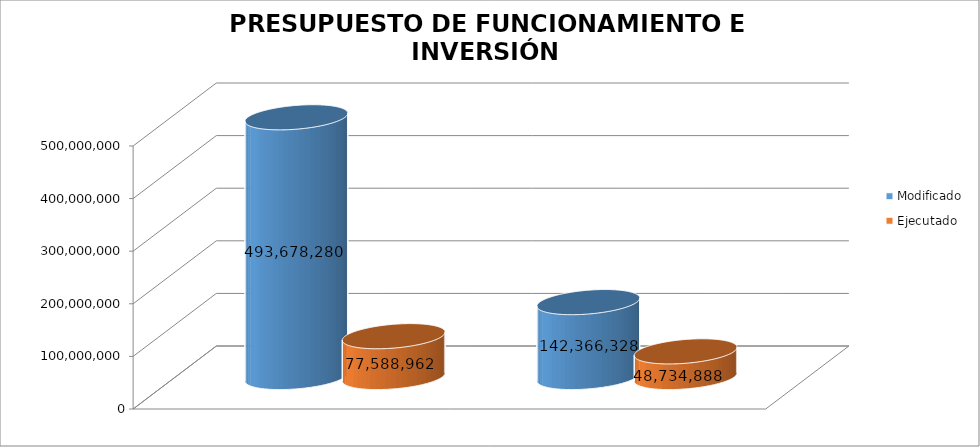
| Category | Modificado | Ejecutado | Series 2 |
|---|---|---|---|
| 0 | 142366328 | 48734888.11 |  |